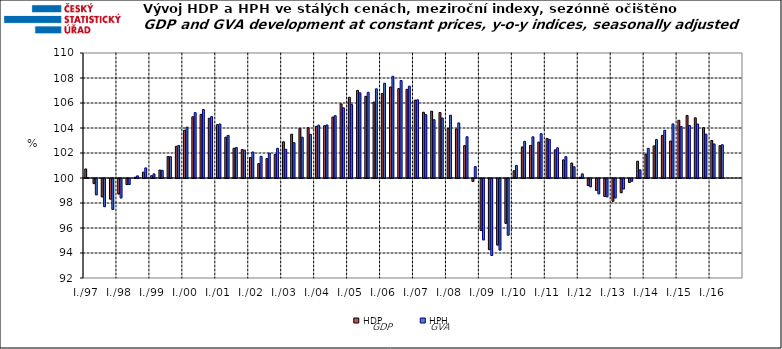
| Category | HDP

 | HPH

 |
|---|---|---|
| I./97 | 100.724 | 100.023 |
|  | 99.593 | 98.696 |
|  | 98.534 | 97.75 |
|  | 98.353 | 97.524 |
| I./98 | 98.764 | 98.448 |
|  | 99.514 | 99.521 |
|  | 100.062 | 100.171 |
|  | 100.468 | 100.809 |
| I./99 | 100.184 | 100.328 |
|  | 100.635 | 100.615 |
|  | 101.718 | 101.7 |
|  | 102.536 | 102.597 |
| I./00 | 103.823 | 104.066 |
|  | 104.898 | 105.228 |
|  | 105.09 | 105.478 |
|  | 104.778 | 104.915 |
| I./01 | 104.275 | 104.318 |
|  | 103.265 | 103.409 |
|  | 102.378 | 102.435 |
|  | 102.281 | 102.231 |
| I./02 | 101.633 | 102.082 |
|  | 101.154 | 101.735 |
|  | 101.558 | 101.989 |
|  | 101.886 | 102.375 |
| I./03 | 102.895 | 102.3 |
|  | 103.502 | 102.829 |
|  | 103.968 | 103.261 |
|  | 104.025 | 103.493 |
| I./04 | 104.133 | 104.228 |
|  | 104.183 | 104.242 |
|  | 104.877 | 104.987 |
|  | 105.93 | 105.616 |
| I./05 | 106.458 | 105.874 |
|  | 107.01 | 106.814 |
|  | 106.532 | 106.856 |
|  | 106.074 | 107.133 |
| I./06 | 106.757 | 107.582 |
|  | 107.281 | 108.134 |
|  | 107.154 | 107.801 |
|  | 107.09 | 107.348 |
| I./07 | 106.231 | 106.255 |
|  | 105.261 | 105.069 |
|  | 105.344 | 104.662 |
|  | 105.24 | 104.803 |
| I./08 | 103.952 | 105.025 |
|  | 103.919 | 104.404 |
|  | 102.591 | 103.301 |
|  | 99.763 | 100.917 |
| I./09 | 95.837 | 95.089 |
|  | 94.311 | 93.843 |
|  | 94.679 | 94.279 |
|  | 96.412 | 95.47 |
| I./10 | 100.58 | 101.003 |
|  | 102.485 | 102.933 |
|  | 102.607 | 103.294 |
|  | 102.876 | 103.545 |
| I./11 | 103.166 | 103.084 |
|  | 102.251 | 102.416 |
|  | 101.45 | 101.709 |
|  | 101.196 | 100.898 |
| I./12 | 100.062 | 100.329 |
|  | 99.434 | 99.341 |
|  | 99.06 | 98.779 |
|  | 98.564 | 98.536 |
| I./13 | 98.182 | 98.444 |
|  | 98.865 | 99.164 |
|  | 99.681 | 99.781 |
|  | 101.344 | 100.651 |
| I./14 | 101.912 | 102.372 |
|  | 102.57 | 103.077 |
|  | 103.409 | 103.816 |
|  | 102.96 | 104.328 |
| I./15 | 104.618 | 104.117 |
|  | 105.004 | 104.204 |
|  | 104.815 | 104.321 |
|  | 104.027 | 103.51 |
| I./16 | 103.006 | 102.725 |